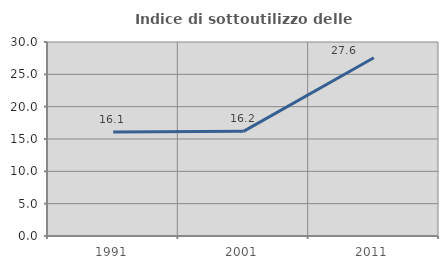
| Category | Indice di sottoutilizzo delle abitazioni  |
|---|---|
| 1991.0 | 16.066 |
| 2001.0 | 16.186 |
| 2011.0 | 27.556 |